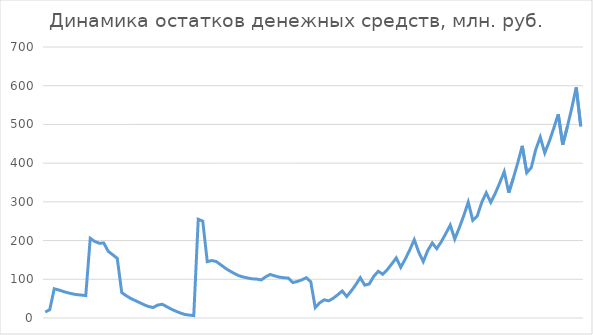
| Category | Series 0 |
|---|---|
| 2015-01-01 | 15340432 |
| 2015-02-01 | 21530992 |
| 2015-03-01 | 75587712 |
| 2015-04-01 | 72341369.486 |
| 2015-05-01 | 68474109.402 |
| 2015-06-01 | 65256821.749 |
| 2015-07-01 | 62434022.061 |
| 2015-08-01 | 60273504.562 |
| 2015-09-01 | 59258393.894 |
| 2015-10-01 | 57928175.201 |
| 2015-11-01 | 205854922.983 |
| 2015-12-01 | 197756522.93 |
| 2016-01-01 | 193129263.222 |
| 2016-02-01 | 193642304.336 |
| 2016-03-01 | 172176707.482 |
| 2016-04-01 | 163304193.242 |
| 2016-05-01 | 153978685.55 |
| 2016-06-01 | 65564069.904 |
| 2016-07-01 | 57622898.387 |
| 2016-08-01 | 50423836.016 |
| 2016-09-01 | 44954527.477 |
| 2016-10-01 | 39607225.275 |
| 2016-11-01 | 34040604.635 |
| 2016-12-01 | 29500060.358 |
| 2017-01-01 | 27165689.047 |
| 2017-02-01 | 33469784.307 |
| 2017-03-01 | 35452146.294 |
| 2017-04-01 | 29332277.55 |
| 2017-05-01 | 22900513.183 |
| 2017-06-01 | 17674943.519 |
| 2017-07-01 | 13074250.498 |
| 2017-08-01 | 9197881.063 |
| 2017-09-01 | 7475094.643 |
| 2017-10-01 | 6248479.417 |
| 2017-11-01 | 255000813.647 |
| 2017-12-01 | 250215761.53 |
| 2018-01-01 | 145619807.323 |
| 2018-02-01 | 148421269.257 |
| 2018-03-01 | 145884442.845 |
| 2018-04-01 | 137499444.894 |
| 2018-05-01 | 128755856.32 |
| 2018-06-01 | 121570465.66 |
| 2018-07-01 | 115123175.267 |
| 2018-08-01 | 109266388.823 |
| 2018-09-01 | 105887446.704 |
| 2018-10-01 | 103239069.775 |
| 2018-11-01 | 101121871.488 |
| 2018-12-01 | 100498981.914 |
| 2019-01-01 | 98284853.206 |
| 2019-02-01 | 106553289.889 |
| 2019-03-01 | 112409734.087 |
| 2019-04-01 | 108796595.56 |
| 2019-05-01 | 105535369.208 |
| 2019-06-01 | 103956524.042 |
| 2019-07-01 | 103084784.758 |
| 2019-08-01 | 91577020.841 |
| 2019-09-01 | 94253425.819 |
| 2019-10-01 | 98348027.33 |
| 2019-11-01 | 104107970.651 |
| 2019-12-01 | 93698291.002 |
| 2020-01-01 | 26903331.739 |
| 2020-02-01 | 39280514.381 |
| 2020-03-01 | 46986984.382 |
| 2020-04-01 | 44300537.865 |
| 2020-05-01 | 51081464.679 |
| 2020-06-01 | 59991033.672 |
| 2020-07-01 | 69789376.866 |
| 2020-08-01 | 55558711.791 |
| 2020-09-01 | 69817010.336 |
| 2020-10-01 | 85871475.179 |
| 2020-11-01 | 104082935.833 |
| 2020-12-01 | 84933357.52 |
| 2021-01-01 | 87786790.367 |
| 2021-02-01 | 107503924.405 |
| 2021-03-01 | 120684094.859 |
| 2021-04-01 | 112800888.068 |
| 2021-05-01 | 124835914.635 |
| 2021-06-01 | 139548024.353 |
| 2021-07-01 | 155377478.151 |
| 2021-08-01 | 130774488.855 |
| 2021-09-01 | 152194285.745 |
| 2021-10-01 | 175860380.524 |
| 2021-11-01 | 202271149.637 |
| 2021-12-01 | 170059670.152 |
| 2022-01-01 | 145741883.74 |
| 2022-02-01 | 174391291.489 |
| 2022-03-01 | 193781150.994 |
| 2022-04-01 | 179176337.522 |
| 2022-05-01 | 196876212.204 |
| 2022-06-01 | 217783853.797 |
| 2022-07-01 | 240030043.633 |
| 2022-08-01 | 203877019.67 |
| 2022-09-01 | 232806945.518 |
| 2022-10-01 | 264418557.636 |
| 2022-11-01 | 299343841.094 |
| 2022-12-01 | 252384351.933 |
| 2023-01-01 | 263282335.511 |
| 2023-02-01 | 298866148.491 |
| 2023-03-01 | 323505569.774 |
| 2023-04-01 | 298726749.709 |
| 2023-05-01 | 321980088.786 |
| 2023-06-01 | 349130802.695 |
| 2023-07-01 | 377909870.361 |
| 2023-08-01 | 323694363.373 |
| 2023-09-01 | 360526221.391 |
| 2023-10-01 | 400585347.005 |
| 2023-11-01 | 444743542.582 |
| 2023-12-01 | 375320842.026 |
| 2024-01-01 | 388440708.955 |
| 2024-02-01 | 435161361.209 |
| 2024-03-01 | 467260004.111 |
| 2024-04-01 | 426319903.531 |
| 2024-05-01 | 455907153.358 |
| 2024-06-01 | 490026266.769 |
| 2024-07-01 | 526047035.689 |
| 2024-08-01 | 447678542.89 |
| 2024-09-01 | 492982419.97 |
| 2024-10-01 | 542001237.473 |
| 2024-11-01 | 595866752.017 |
| 2024-12-01 | 495054845.73 |